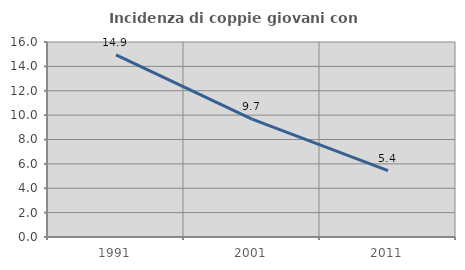
| Category | Incidenza di coppie giovani con figli |
|---|---|
| 1991.0 | 14.938 |
| 2001.0 | 9.671 |
| 2011.0 | 5.439 |